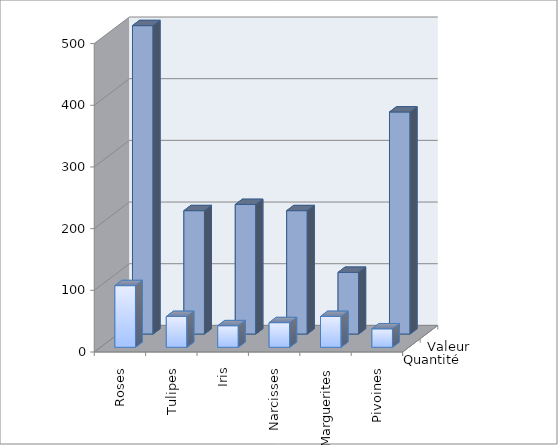
| Category | Quantité | Valeur |
|---|---|---|
| Roses | 100 | 500 |
| Tulipes | 50 | 200 |
| Iris | 35 | 210 |
| Narcisses | 40 | 200 |
| Marguerites | 50 | 100 |
| Pivoines | 30 | 360 |